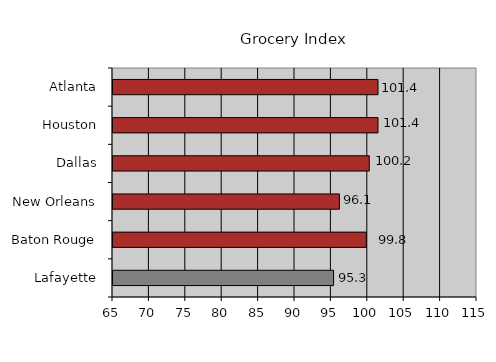
| Category | 95.3 |
|---|---|
| Lafayette | 95.3 |
| Baton Rouge | 99.8 |
| New Orleans | 96.1 |
| Dallas | 100.2 |
| Houston | 101.4 |
| Atlanta | 101.4 |